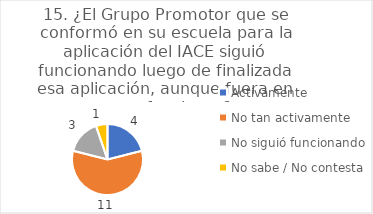
| Category | 15. ¿El Grupo Promotor que se conformó en su escuela para la aplicación del IACE siguió funcionando luego de finalizada esa aplicación, aunque fuera en otras funciones? |
|---|---|
| Activamente  | 0.211 |
| No tan activamente  | 0.579 |
| No siguió funcionando  | 0.158 |
| No sabe / No contesta | 0.053 |